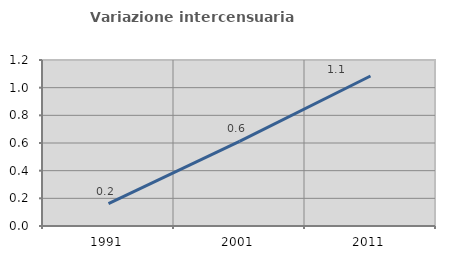
| Category | Variazione intercensuaria annua |
|---|---|
| 1991.0 | 0.162 |
| 2001.0 | 0.612 |
| 2011.0 | 1.084 |